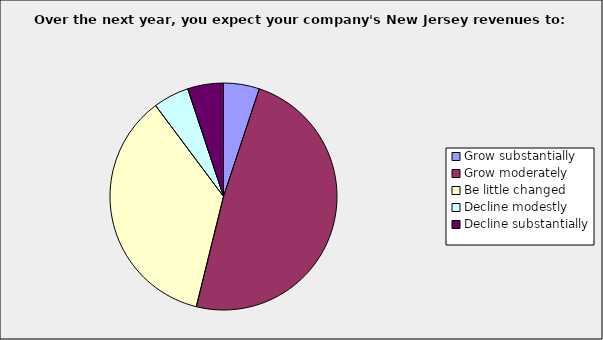
| Category | Series 0 |
|---|---|
| Grow substantially | 0.051 |
| Grow moderately | 0.487 |
| Be little changed | 0.359 |
| Decline modestly | 0.051 |
| Decline substantially | 0.051 |